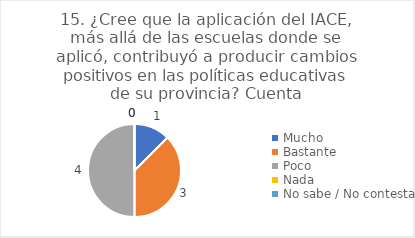
| Category | 15. ¿Cree que la aplicación del IACE, más allá de las escuelas donde se aplicó, contribuyó a producir cambios positivos en las políticas educativas de su provincia? |
|---|---|
| Mucho  | 0.125 |
| Bastante  | 0.375 |
| Poco  | 0.5 |
| Nada  | 0 |
| No sabe / No contesta | 0 |